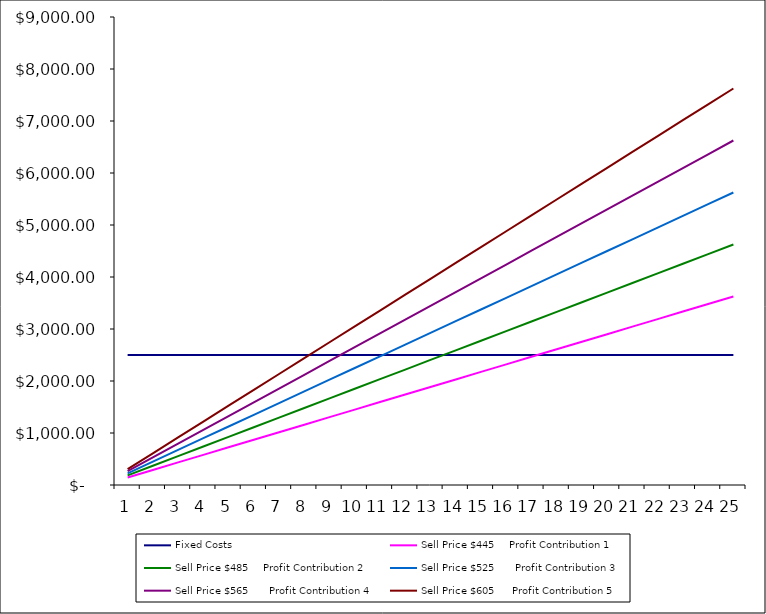
| Category | Fixed Costs | Sell Price $445     Profit Contribution 1 | Sell Price $485     Profit Contribution 2 | Sell Price $525       Profit Contribution 3 | Sell Price $565       Profit Contribution 4 | Sell Price $605      Profit Contribution 5 |
|---|---|---|---|---|---|---|
| 0 | 2500 | 145 | 185 | 225 | 265 | 305 |
| 1 | 2500 | 290 | 370 | 450 | 530 | 610 |
| 2 | 2500 | 435 | 555 | 675 | 795 | 915 |
| 3 | 2500 | 580 | 740 | 900 | 1060 | 1220 |
| 4 | 2500 | 725 | 925 | 1125 | 1325 | 1525 |
| 5 | 2500 | 870 | 1110 | 1350 | 1590 | 1830 |
| 6 | 2500 | 1015 | 1295 | 1575 | 1855 | 2135 |
| 7 | 2500 | 1160 | 1480 | 1800 | 2120 | 2440 |
| 8 | 2500 | 1305 | 1665 | 2025 | 2385 | 2745 |
| 9 | 2500 | 1450 | 1850 | 2250 | 2650 | 3050 |
| 10 | 2500 | 1595 | 2035 | 2475 | 2915 | 3355 |
| 11 | 2500 | 1740 | 2220 | 2700 | 3180 | 3660 |
| 12 | 2500 | 1885 | 2405 | 2925 | 3445 | 3965 |
| 13 | 2500 | 2030 | 2590 | 3150 | 3710 | 4270 |
| 14 | 2500 | 2175 | 2775 | 3375 | 3975 | 4575 |
| 15 | 2500 | 2320 | 2960 | 3600 | 4240 | 4880 |
| 16 | 2500 | 2465 | 3145 | 3825 | 4505 | 5185 |
| 17 | 2500 | 2610 | 3330 | 4050 | 4770 | 5490 |
| 18 | 2500 | 2755 | 3515 | 4275 | 5035 | 5795 |
| 19 | 2500 | 2900 | 3700 | 4500 | 5300 | 6100 |
| 20 | 2500 | 3045 | 3885 | 4725 | 5565 | 6405 |
| 21 | 2500 | 3190 | 4070 | 4950 | 5830 | 6710 |
| 22 | 2500 | 3335 | 4255 | 5175 | 6095 | 7015 |
| 23 | 2500 | 3480 | 4440 | 5400 | 6360 | 7320 |
| 24 | 2500 | 3625 | 4625 | 5625 | 6625 | 7625 |